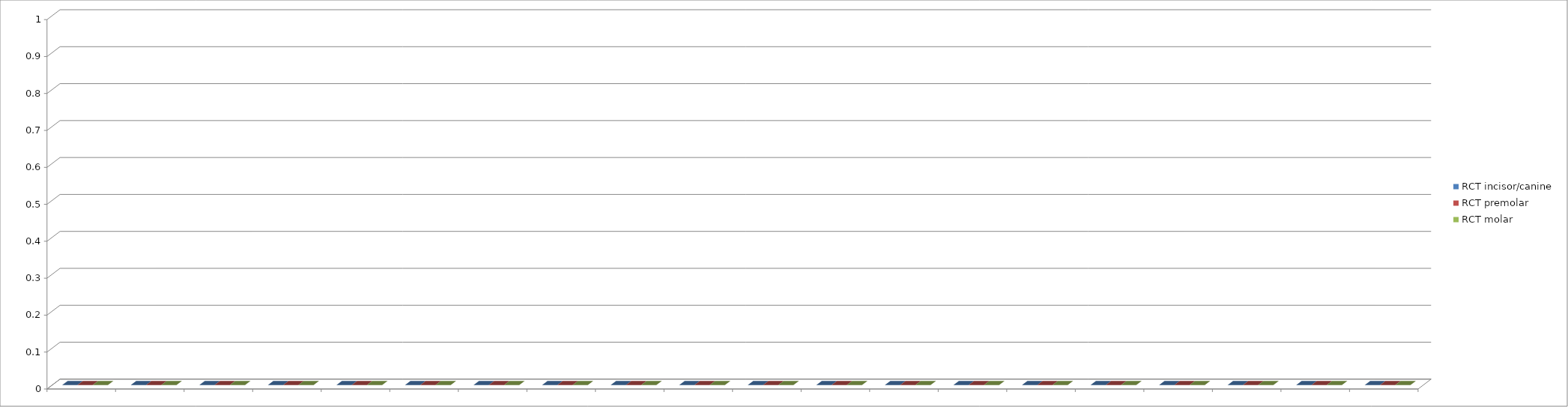
| Category | RCT incisor/canine | RCT premolar | RCT molar |
|---|---|---|---|
| 0 | 0 | 0 | 0 |
| 1 | 0 | 0 | 0 |
| 2 | 0 | 0 | 0 |
| 3 | 0 | 0 | 0 |
| 4 | 0 | 0 | 0 |
| 5 | 0 | 0 | 0 |
| 6 | 0 | 0 | 0 |
| 7 | 0 | 0 | 0 |
| 8 | 0 | 0 | 0 |
| 9 | 0 | 0 | 0 |
| 10 | 0 | 0 | 0 |
| 11 | 0 | 0 | 0 |
| 12 | 0 | 0 | 0 |
| 13 | 0 | 0 | 0 |
| 14 | 0 | 0 | 0 |
| 15 | 0 | 0 | 0 |
| 16 | 0 | 0 | 0 |
| 17 | 0 | 0 | 0 |
| 18 | 0 | 0 | 0 |
| 19 | 0 | 0 | 0 |